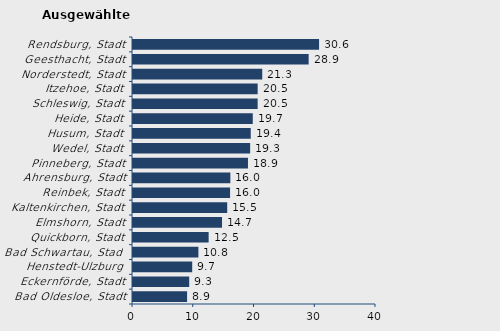
| Category | Wanderungssaldo |
|---|---|
| Bad Oldesloe, Stadt | 8.903 |
| Eckernförde, Stadt | 9.253 |
| Henstedt-Ulzburg | 9.745 |
| Bad Schwartau, Stadt | 10.763 |
| Quickborn, Stadt | 12.452 |
| Elmshorn, Stadt | 14.654 |
| Kaltenkirchen, Stadt | 15.507 |
| Reinbek, Stadt | 15.98 |
| Ahrensburg, Stadt | 16.025 |
| Pinneberg, Stadt | 18.925 |
| Wedel, Stadt | 19.283 |
| Husum, Stadt | 19.381 |
| Heide, Stadt | 19.716 |
| Schleswig, Stadt | 20.517 |
| Itzehoe, Stadt | 20.522 |
| Norderstedt, Stadt | 21.275 |
| Geesthacht, Stadt | 28.915 |
| Rendsburg, Stadt | 30.629 |